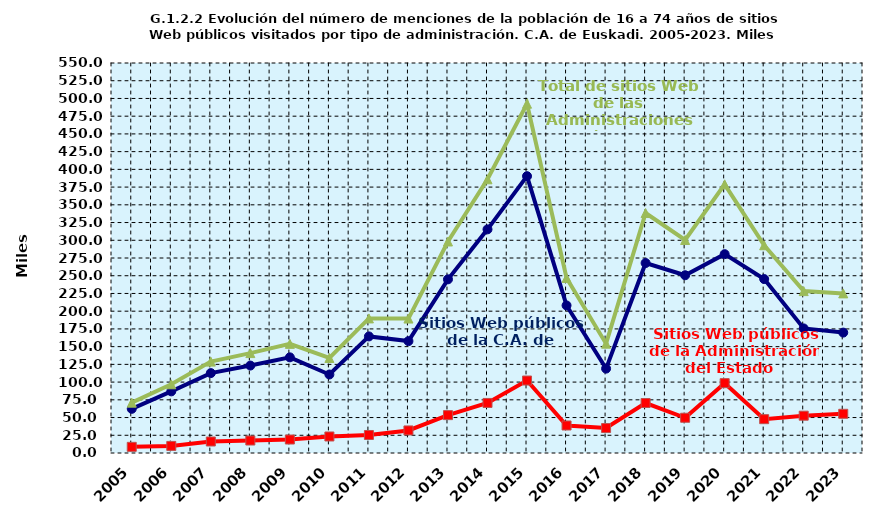
| Category | Sitios Web públicos de la C.A. de Euskadi | Sitios Web públicos de la Administración del Estado | Total de sitios Web de las Administraciones Públicas |
|---|---|---|---|
| 2005.0 | 62.3 | 8.7 | 71 |
| 2006.0 | 86.9 | 10 | 96.9 |
| 2007.0 | 112.7 | 16.2 | 128.9 |
| 2008.0 | 123.3 | 17.6 | 140.9 |
| 2009.0 | 134.9 | 19 | 153.9 |
| 2010.0 | 110.7 | 23.3 | 134 |
| 2011.0 | 164.4 | 25.4 | 189.8 |
| 2012.0 | 157.8 | 31.8 | 189.6 |
| 2013.0 | 244.9 | 53.4 | 298.3 |
| 2014.0 | 315.4 | 70.6 | 386 |
| 2015.0 | 390.4 | 102.2 | 492.6 |
| 2016.0 | 208.1 | 38.8 | 246.9 |
| 2017.0 | 119 | 35.2 | 154.2 |
| 2018.0 | 267.9 | 70.5 | 338.4 |
| 2019.0 | 250.7 | 49.7 | 300.4 |
| 2020.0 | 280.4 | 98.5 | 378.9 |
| 2021.0 | 245.3 | 47.7 | 293 |
| 2022.0 | 175.7 | 52.6 | 228.3 |
| 2023.0 | 169.8 | 55.3 | 225.1 |